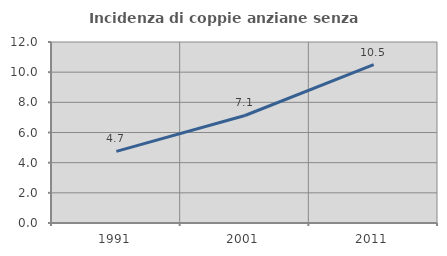
| Category | Incidenza di coppie anziane senza figli  |
|---|---|
| 1991.0 | 4.745 |
| 2001.0 | 7.127 |
| 2011.0 | 10.499 |